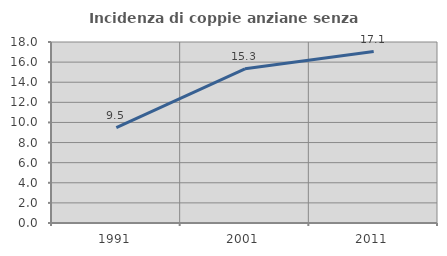
| Category | Incidenza di coppie anziane senza figli  |
|---|---|
| 1991.0 | 9.478 |
| 2001.0 | 15.337 |
| 2011.0 | 17.055 |